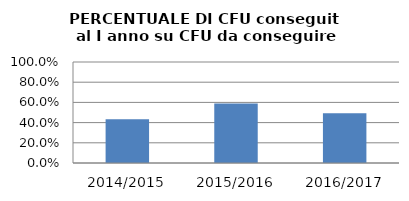
| Category | 2014/2015 2015/2016 2016/2017 |
|---|---|
| 2014/2015 | 0.434 |
| 2015/2016 | 0.589 |
| 2016/2017 | 0.494 |